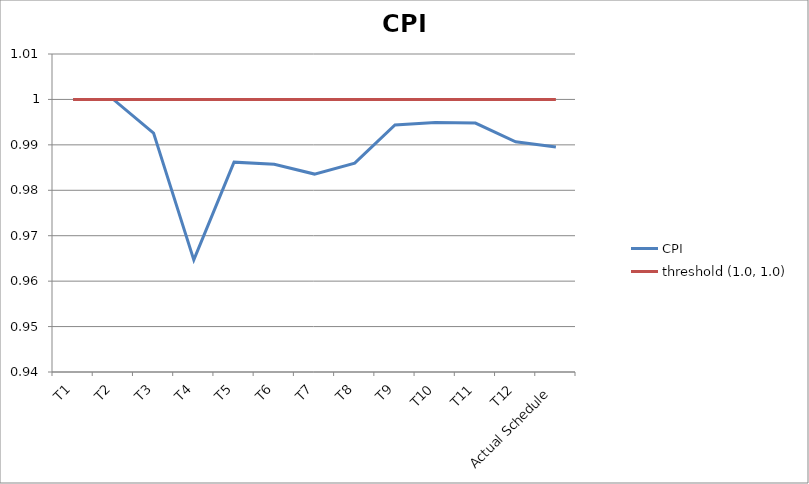
| Category | CPI | threshold (1.0, 1.0) |
|---|---|---|
| T1 | 1 | 1 |
| T2 | 1 | 1 |
| T3 | 0.993 | 1 |
| T4 | 0.965 | 1 |
| T5 | 0.986 | 1 |
| T6 | 0.986 | 1 |
| T7 | 0.984 | 1 |
| T8 | 0.986 | 1 |
| T9 | 0.994 | 1 |
| T10 | 0.995 | 1 |
| T11 | 0.995 | 1 |
| T12 | 0.991 | 1 |
| Actual Schedule | 0.99 | 1 |